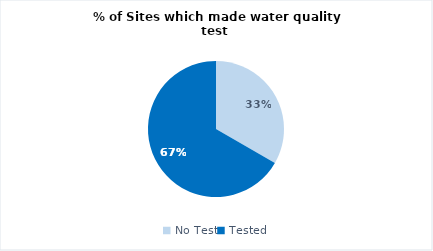
| Category | Rakhine |
|---|---|
| No Test | 8 |
| Tested | 16 |